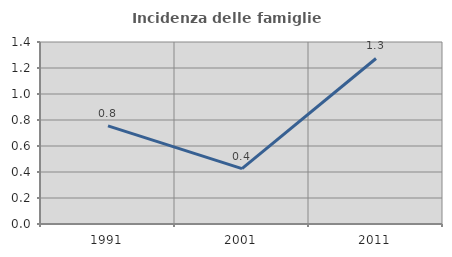
| Category | Incidenza delle famiglie numerose |
|---|---|
| 1991.0 | 0.755 |
| 2001.0 | 0.426 |
| 2011.0 | 1.273 |